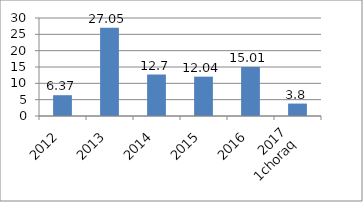
| Category | Series 0 |
|---|---|
| 2012 | 6.37 |
| 2013 | 27.05 |
| 2014 | 12.7 |
| 2015 | 12.04 |
| 2016 | 15.01 |
| 2017
1choraq | 3.8 |